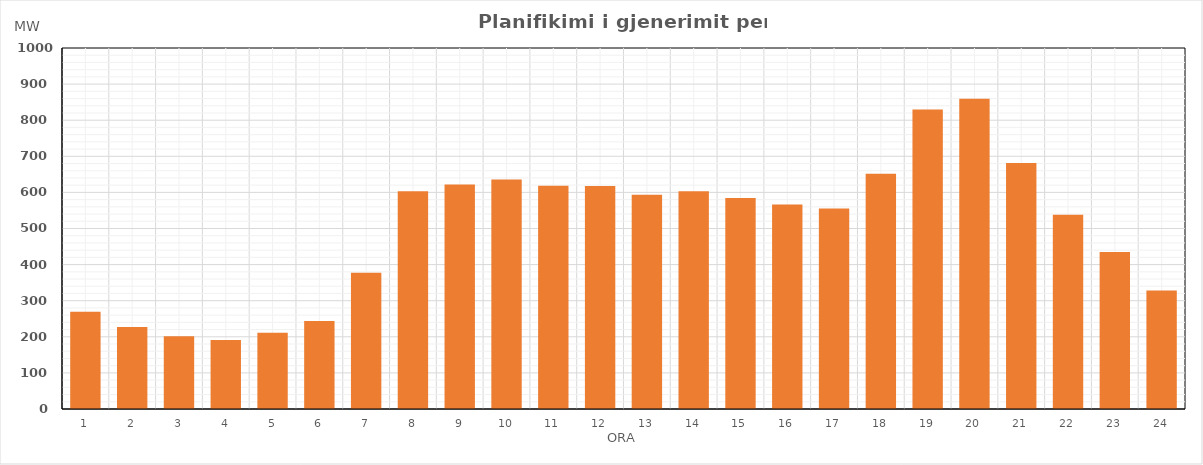
| Category | Max (MW) |
|---|---|
| 0 | 269.382 |
| 1 | 227.325 |
| 2 | 201.335 |
| 3 | 191.137 |
| 4 | 210.966 |
| 5 | 243.953 |
| 6 | 377.549 |
| 7 | 603.225 |
| 8 | 621.841 |
| 9 | 635.606 |
| 10 | 618.486 |
| 11 | 617.734 |
| 12 | 593.485 |
| 13 | 603.255 |
| 14 | 584.173 |
| 15 | 566.418 |
| 16 | 555.098 |
| 17 | 651.781 |
| 18 | 829.774 |
| 19 | 859.658 |
| 20 | 681.719 |
| 21 | 538.043 |
| 22 | 435.208 |
| 23 | 328.204 |